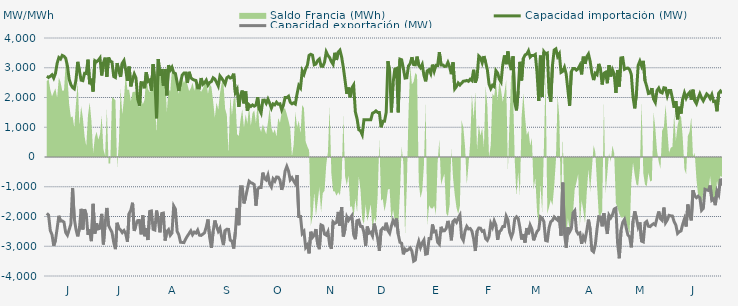
| Category | Capacidad importación (MW) | Capacidad exportación (MW) |
|---|---|---|
| 0 | 2714.417 | -1890.667 |
| 1900-01-01 | 2675.25 | -1952.042 |
| 1900-01-02 | 2712.625 | -2473.333 |
| 1900-01-03 | 2762.542 | -2608.917 |
| 1900-01-04 | 2652 | -2984.583 |
| 1900-01-05 | 2806.792 | -2803.333 |
| 1900-01-06 | 3151.167 | -2401.458 |
| 1900-01-07 | 3341.792 | -1976.417 |
| 1900-01-08 | 3295.083 | -2154.25 |
| 1900-01-09 | 3415.542 | -2148.458 |
| 1900-01-10 | 3386.458 | -2191.625 |
| 1900-01-11 | 3315.833 | -2538.333 |
| 1900-01-12 | 3059.75 | -2627.417 |
| 1900-01-13 | 2619.042 | -2445.958 |
| 1900-01-14 | 2434.542 | -2258.708 |
| 1900-01-15 | 2336.958 | -1043.75 |
| 1900-01-16 | 2291.5 | -2066.667 |
| 1900-01-17 | 2591.375 | -2432.417 |
| 1900-01-18 | 3198.167 | -2666.208 |
| 1900-01-19 | 2894.833 | -2404.875 |
| 1900-01-20 | 2582.208 | -1743.542 |
| 1900-01-21 | 2566.333 | -2434.875 |
| 1900-01-22 | 2811.458 | -1757.708 |
| 1900-01-23 | 2808 | -1938.167 |
| 1900-01-24 | 3272.083 | -2618.542 |
| 1900-01-25 | 2447.208 | -2437.333 |
| 1900-01-26 | 2633.208 | -2826.667 |
| 1900-01-27 | 2202.083 | -1575 |
| 1900-01-28 | 3237.583 | -2574.625 |
| 1900-01-29 | 3201.042 | -2230.542 |
| 1900-01-30 | 3248.625 | -2416.417 |
| 1900-01-31 | 3327.583 | -2395.083 |
| 1900-02-01 | 2740.958 | -1910.417 |
| 1900-02-02 | 3160.083 | -2937.917 |
| 1900-02-03 | 3339 | -2237.833 |
| 1900-02-04 | 2697.208 | -1712.5 |
| 1900-02-05 | 3342.917 | -2305.083 |
| 1900-02-06 | 3218 | -2421.583 |
| 1900-02-07 | 3194.333 | -2530.333 |
| 1900-02-08 | 2706.458 | -2869.083 |
| 1900-02-09 | 2673 | -3096.5 |
| 1900-02-10 | 3156.5 | -2212.083 |
| 1900-02-11 | 2884.958 | -2401.708 |
| 1900-02-12 | 2692.292 | -2450.833 |
| 1900-02-13 | 3152.125 | -2539.5 |
| 1900-02-14 | 3244.042 | -2473.208 |
| 1900-02-15 | 2930.458 | -2581.292 |
| 1900-02-16 | 2559.833 | -2848.708 |
| 1900-02-17 | 3037.583 | -1901.417 |
| 1900-02-18 | 2375 | -1787.5 |
| 1900-02-19 | 2608.75 | -1537.5 |
| 1900-02-20 | 2790.667 | -2487.458 |
| 1900-02-21 | 2656.542 | -2277.167 |
| 1900-02-22 | 1950.833 | -2138.208 |
| 1900-02-23 | 1725 | -2133.333 |
| 1900-02-24 | 2500 | -2600 |
| 1900-02-25 | 2493.5 | -1964.583 |
| 1900-02-26 | 2311.125 | -2662.542 |
| 1900-02-27 | 2848.5 | -2386.333 |
| 1900-02-28 | 2541.5 | -2790.625 |
| 1900-02-28 | 2586.083 | -1829.542 |
| 1900-03-01 | 2229.167 | -1813.75 |
| 1900-03-02 | 3118.458 | -2430.875 |
| 1900-03-03 | 2560.5 | -2453.333 |
| 1900-03-04 | 1300 | -1800 |
| 1900-03-05 | 3293.208 | -2107.333 |
| 1900-03-06 | 2732.333 | -2531.667 |
| 1900-03-07 | 2958.208 | -1899.667 |
| 1900-03-08 | 2400 | -1885.417 |
| 1900-03-09 | 2949.792 | -2809.042 |
| 1900-03-10 | 2072.292 | -2500 |
| 1900-03-11 | 3083.958 | -2440.167 |
| 1900-03-12 | 2921.208 | -2632.667 |
| 1900-03-13 | 3017.667 | -2556.542 |
| 1900-03-14 | 2833.833 | -1646.083 |
| 1900-03-15 | 2807.833 | -1750 |
| 1900-03-16 | 2510.417 | -2496.792 |
| 1900-03-17 | 2220.833 | -2618.625 |
| 1900-03-18 | 2512.5 | -2867.042 |
| 1900-03-19 | 2756.375 | -2870.75 |
| 1900-03-20 | 2821.542 | -2876.667 |
| 1900-03-21 | 2821.833 | -2755.625 |
| 1900-03-22 | 2490.292 | -2656.833 |
| 1900-03-23 | 2862.667 | -2571.458 |
| 1900-03-24 | 2663.042 | -2482.25 |
| 1900-03-25 | 2613.625 | -2612.792 |
| 1900-03-26 | 2585.667 | -2523.458 |
| 1900-03-27 | 2571.292 | -2556.167 |
| 1900-03-28 | 2320.458 | -2456.542 |
| 1900-03-29 | 2316.542 | -2627.667 |
| 1900-03-30 | 2652.5 | -2635.708 |
| 1900-03-31 | 2442.625 | -2594.208 |
| 1900-04-01 | 2493.458 | -2546.125 |
| 1900-04-02 | 2582.917 | -2351.208 |
| 1900-04-03 | 2416.667 | -2100 |
| 1900-04-04 | 2504.5 | -2703.167 |
| 1900-04-05 | 2536.625 | -3052.25 |
| 1900-04-06 | 2662.208 | -2510.833 |
| 1900-04-07 | 2620.667 | -2134.75 |
| 1900-04-08 | 2511.833 | -2330.583 |
| 1900-04-09 | 2387.333 | -2494.25 |
| 1900-04-10 | 2724.583 | -2389 |
| 1900-04-11 | 2648.667 | -2691.542 |
| 1900-04-12 | 2557.292 | -2961.542 |
| 1900-04-13 | 2454.083 | -2472.25 |
| 1900-04-14 | 2661.417 | -2427.292 |
| 1900-04-15 | 2704.833 | -2434.167 |
| 1900-04-16 | 2653.75 | -2795.833 |
| 1900-04-17 | 2673.75 | -2822.875 |
| 1900-04-18 | 2800.917 | -3075.208 |
| 1900-04-19 | 2164.417 | -2510.625 |
| 1900-04-20 | 2270.833 | -1713.542 |
| 1900-04-21 | 1687.5 | -2291.667 |
| 1900-04-22 | 2066.667 | -1000 |
| 1900-04-23 | 2233.333 | -1000 |
| 1900-04-24 | 1804.167 | -1561.333 |
| 1900-04-25 | 2201.833 | -1341.667 |
| 1900-04-26 | 1556.25 | -1070.833 |
| 1900-04-27 | 1756.25 | -812.5 |
| 1900-04-28 | 1700 | -864.583 |
| 1900-04-29 | 1750 | -885.417 |
| 1900-04-30 | 1708.333 | -929.167 |
| 1900-05-01 | 1743.75 | -1636.25 |
| 1900-05-02 | 2008.083 | -1077.083 |
| 1900-05-03 | 1602.083 | -1020.833 |
| 1900-05-04 | 1479.167 | -1022.917 |
| 1900-05-05 | 1910.417 | -525 |
| 1900-05-06 | 1912.5 | -727.083 |
| 1900-05-07 | 1804.167 | -775 |
| 1900-05-08 | 1945.833 | -608.333 |
| 1900-05-09 | 1808.333 | -904.167 |
| 1900-05-10 | 1641.667 | -1006.25 |
| 1900-05-11 | 1785.417 | -735.417 |
| 1900-05-12 | 1752.083 | -812.5 |
| 1900-05-13 | 1841.667 | -675 |
| 1900-05-14 | 1772.917 | -677.083 |
| 1900-05-15 | 1788 | -777.083 |
| 1900-05-16 | 1587.5 | -1104.167 |
| 1900-05-17 | 1737.5 | -900 |
| 1900-05-18 | 1997.917 | -475 |
| 1900-05-19 | 1995.833 | -316.667 |
| 1900-05-20 | 2041.667 | -468.75 |
| 1900-05-21 | 1843.75 | -766.667 |
| 1900-05-22 | 1787.5 | -695.833 |
| 1900-05-23 | 1820.833 | -808.333 |
| 1900-05-24 | 1781.25 | -900 |
| 1900-05-25 | 2126.667 | -608.333 |
| 1900-05-26 | 2404.417 | -2000 |
| 1900-05-27 | 2323.167 | -2000 |
| 1900-05-28 | 2893.583 | -2571.5 |
| 1900-05-29 | 2778.083 | -2500.25 |
| 1900-05-30 | 2965.5 | -3038.667 |
| 1900-05-31 | 3083.64 | -2955.48 |
| 1900-06-01 | 3418.208 | -3238.958 |
| 1900-06-02 | 3452.875 | -2513.333 |
| 1900-06-03 | 3420.292 | -2703.208 |
| 1900-06-04 | 3100.083 | -2630.333 |
| 1900-06-05 | 3123.375 | -2422.458 |
| 1900-06-06 | 3242.792 | -2928.833 |
| 1900-06-07 | 3294.958 | -3098.417 |
| 1900-06-08 | 3054.042 | -2285.333 |
| 1900-06-09 | 3047.542 | -2315.25 |
| 1900-06-10 | 3179.458 | -2592.333 |
| 1900-06-11 | 3533.833 | -2627.792 |
| 1900-06-12 | 3414 | -2509.75 |
| 1900-06-13 | 3340.25 | -2944.208 |
| 1900-06-14 | 3208.208 | -3084.875 |
| 1900-06-15 | 3116.333 | -2180.292 |
| 1900-06-16 | 3502.875 | -2231.333 |
| 1900-06-17 | 3262.542 | -2201.667 |
| 1900-06-18 | 3524.167 | -1845.708 |
| 1900-06-19 | 3589.042 | -2314 |
| 1900-06-20 | 3358.375 | -1684.042 |
| 1900-06-21 | 3002 | -2672.375 |
| 1900-06-22 | 2567.583 | -2409.375 |
| 1900-06-23 | 2121 | -2013.417 |
| 1900-06-24 | 2334.5 | -2132.333 |
| 1900-06-25 | 2006.833 | -2047.042 |
| 1900-06-26 | 2325 | -1968.542 |
| 1900-06-27 | 2420.75 | -2611.292 |
| 1900-06-28 | 1517.25 | -2763 |
| 1900-06-29 | 1283.917 | -2141.667 |
| 1900-06-30 | 916.417 | -2120.833 |
| 1900-07-01 | 879.167 | -2332.417 |
| 1900-07-02 | 750 | -2334.958 |
| 1900-07-03 | 1250 | -2536 |
| 1900-07-04 | 1250 | -2982 |
| 1900-07-05 | 1250 | -2338.583 |
| 1900-07-06 | 1250 | -2558.333 |
| 1900-07-07 | 1250 | -2526.375 |
| 1900-07-08 | 1470.833 | -2652.25 |
| 1900-07-09 | 1500 | -2239.292 |
| 1900-07-10 | 1550 | -2486.75 |
| 1900-07-11 | 1500 | -2733.5 |
| 1900-07-12 | 1500 | -3155.125 |
| 1900-07-13 | 1000 | -2458.542 |
| 1900-07-14 | 1200 | -2385.25 |
| 1900-07-15 | 1200 | -2419 |
| 1900-07-16 | 1500 | -2208.75 |
| 1900-07-17 | 3221.708 | -2468.625 |
| 1900-07-18 | 2881.375 | -2561.25 |
| 1900-07-19 | 1500 | -2320.833 |
| 1900-07-20 | 2479.75 | -2136.875 |
| 1900-07-21 | 2947.875 | -2253.917 |
| 1900-07-22 | 2974.833 | -2068.75 |
| 1900-07-23 | 1500 | -2595.083 |
| 1900-07-24 | 3289.208 | -2867.583 |
| 1900-07-25 | 3267.875 | -2898.625 |
| 1900-07-26 | 2979.083 | -3270.083 |
| 1900-07-27 | 2652.375 | -3097.333 |
| 1900-07-28 | 2663.208 | -3144.542 |
| 1900-07-29 | 3058.292 | -3107.917 |
| 1900-07-30 | 3141.958 | -3054.292 |
| 1900-07-31 | 3354.667 | -3163.833 |
| 1900-08-01 | 3106.083 | -3500.875 |
| 1900-08-02 | 3099.042 | -3464.417 |
| 1900-08-03 | 3374.208 | -3046.25 |
| 1900-08-04 | 3081.083 | -2836.417 |
| 1900-08-05 | 3002 | -3040.417 |
| 1900-08-06 | 3113.875 | -2884.417 |
| 1900-08-07 | 2746.792 | -2789.333 |
| 1900-08-08 | 2544 | -3266.167 |
| 1900-08-09 | 2896.458 | -3250.667 |
| 1900-08-10 | 2937 | -2740.375 |
| 1900-08-11 | 2803.458 | -2745 |
| 1900-08-12 | 3104.125 | -2267.833 |
| 1900-08-13 | 2884.333 | -2514.583 |
| 1900-08-14 | 3081.042 | -2493.458 |
| 1900-08-15 | 3079.083 | -2866 |
| 1900-08-16 | 3524.292 | -2932.083 |
| 1900-08-17 | 3096.5 | -2347.083 |
| 1900-08-18 | 3096.5 | -2484.875 |
| 1900-08-19 | 3044.417 | -2478.583 |
| 1900-08-20 | 3048.167 | -2403.5 |
| 1900-08-21 | 3181.083 | -2147.542 |
| 1900-08-22 | 3030.708 | -2365.833 |
| 1900-08-23 | 2784.5 | -2801.333 |
| 1900-08-24 | 3182.417 | -2165.083 |
| 1900-08-25 | 2292.583 | -2110.5 |
| 1900-08-26 | 2370.25 | -2192.75 |
| 1900-08-27 | 2487.208 | -2051.417 |
| 1900-08-28 | 2421.292 | -1952.083 |
| 1900-08-29 | 2482.917 | -2699.375 |
| 1900-08-30 | 2548.458 | -2805.375 |
| 1900-08-31 | 2554.458 | -2484.042 |
| 1900-09-01 | 2574.083 | -2331.417 |
| 1900-09-02 | 2544.458 | -2417.833 |
| 1900-09-03 | 2615.833 | -2403.25 |
| 1900-09-04 | 2568.917 | -2488.625 |
| 1900-09-05 | 2932.208 | -2748.875 |
| 1900-09-06 | 2500.875 | -3160.125 |
| 1900-09-07 | 2689.458 | -2491.667 |
| 1900-09-08 | 3392.292 | -2386.5 |
| 1900-09-09 | 3335.083 | -2392.75 |
| 1900-09-10 | 3167.5 | -2500.5 |
| 1900-09-11 | 3390.625 | -2475.917 |
| 1900-09-12 | 3180.958 | -2741.75 |
| 1900-09-13 | 2936.5 | -2801.625 |
| 1900-09-14 | 2452.792 | -2674.667 |
| 1900-09-15 | 2300.208 | -2235.25 |
| 1900-09-16 | 2411.792 | -2365.167 |
| 1900-09-17 | 2366.75 | -2147.917 |
| 1900-09-18 | 2902.042 | -2292.875 |
| 1900-09-19 | 2822.25 | -2784.375 |
| 1900-09-20 | 2619.333 | -2505.792 |
| 1900-09-21 | 2523.292 | -2462.542 |
| 1900-09-22 | 3101.75 | -2337.5 |
| 1900-09-23 | 3414.042 | -2335.5 |
| 1900-09-24 | 3119.417 | -1987.458 |
| 1900-09-25 | 3547.333 | -2114.583 |
| 1900-09-26 | 3135.708 | -2530.042 |
| 1900-09-27 | 2921.125 | -2699.333 |
| 1900-09-28 | 3380.917 | -2535.75 |
| 1900-09-29 | 1842.042 | -2078.542 |
| 1900-09-30 | 1566.833 | -2010.417 |
| 1900-10-01 | 2214.542 | -2066.667 |
| 1900-10-02 | 3198.583 | -2370 |
| 1900-10-03 | 2574 | -2772.958 |
| 1900-10-04 | 3310.583 | -2592.083 |
| 1900-10-05 | 3430.75 | -2875.542 |
| 1900-10-06 | 3458.333 | -2387.75 |
| 1900-10-07 | 3568.125 | -2599.208 |
| 1900-10-08 | 3355.708 | -2294.333 |
| 1900-10-09 | 3414.333 | -2427 |
| 1900-10-10 | 3410.542 | -2802.125 |
| 1900-10-11 | 3447.375 | -2640.958 |
| 1900-10-12 | 2831.208 | -2506.667 |
| 1900-10-13 | 1881.583 | -2434.25 |
| 1900-10-14 | 3406.708 | -2011.583 |
| 1900-10-15 | 2022.5 | -2050 |
| 1900-10-16 | 3540.875 | -2176.417 |
| 1900-10-17 | 3466.542 | -2807.167 |
| 1900-10-18 | 3493.375 | -2823.167 |
| 1900-10-19 | 2166.833 | -2382.125 |
| 1900-10-20 | 1859.958 | -2177.167 |
| 1900-10-21 | 3077.875 | -2132.833 |
| 1900-10-22 | 3595.75 | -2015.417 |
| 1900-10-23 | 3634.375 | -2069.417 |
| 1900-10-24 | 3379.833 | -2125 |
| 1900-10-25 | 3470.304 | -1991.957 |
| 1900-10-26 | 2844 | -2641.708 |
| 1900-10-27 | 2880.625 | -862.5 |
| 1900-10-28 | 3017.208 | -2558.208 |
| 1900-10-29 | 2787.708 | -3047.042 |
| 1900-10-30 | 2256.625 | -2365.667 |
| 1900-10-31 | 1722.917 | -2515.917 |
| 1900-11-01 | 2869 | -2405.667 |
| 1900-11-02 | 2973.167 | -1879.167 |
| 1900-11-03 | 2971 | -1806.25 |
| 1900-11-04 | 2919.208 | -2484.833 |
| 1900-11-05 | 2973.125 | -2583.917 |
| 1900-11-06 | 3083.25 | -2551.375 |
| 1900-11-07 | 2777.875 | -2917.292 |
| 1900-11-08 | 3371.833 | -2672.292 |
| 1900-11-09 | 3131 | -2785.25 |
| 1900-11-10 | 3368.375 | -2480.958 |
| 1900-11-11 | 3462.292 | -2105.333 |
| 1900-11-12 | 3215.917 | -2442.958 |
| 1900-11-13 | 2817.875 | -3136.917 |
| 1900-11-14 | 2586 | -3188.792 |
| 1900-11-15 | 2815 | -2954.042 |
| 1900-11-16 | 2767 | -2418.75 |
| 1900-11-17 | 3129.208 | -2005 |
| 1900-11-18 | 2953.792 | -2013.417 |
| 1900-11-19 | 2437.083 | -2329.833 |
| 1900-11-20 | 2815.958 | -1889.333 |
| 1900-11-21 | 2849.708 | -2257.667 |
| 1900-11-22 | 2479.208 | -2586.833 |
| 1900-11-23 | 3084.333 | -1954.5 |
| 1900-11-24 | 2707.042 | -2046.583 |
| 1900-11-25 | 2933.542 | -1941.667 |
| 1900-11-26 | 2795.917 | -1750 |
| 1900-11-27 | 2158.042 | -1718.75 |
| 1900-11-28 | 2918.875 | -2898.083 |
| 1900-11-29 | 2368.375 | -3404.167 |
| 1900-11-30 | 3329.75 | -2465.083 |
| 1900-12-01 | 3339.208 | -2197.25 |
| 1900-12-02 | 2948.5 | -2100.583 |
| 1900-12-03 | 2980.792 | -2371.042 |
| 1900-12-04 | 2990.708 | -2620.708 |
| 1900-12-05 | 2938.333 | -2683 |
| 1900-12-06 | 2774.542 | -3036.75 |
| 1900-12-07 | 2014.917 | -2156.292 |
| 1900-12-08 | 1635.417 | -1825.292 |
| 1900-12-09 | 2140.25 | -2060.75 |
| 1900-12-10 | 3080.917 | -2353.125 |
| 1900-12-11 | 3223.333 | -2199.083 |
| 1900-12-12 | 3058.083 | -2827.667 |
| 1900-12-13 | 3231.167 | -2853.292 |
| 1900-12-14 | 2562 | -2213.625 |
| 1900-12-15 | 2375 | -2164.25 |
| 1900-12-16 | 2133.333 | -2329.5 |
| 1900-12-17 | 2150 | -2341.083 |
| 1900-12-18 | 2314.583 | -2282 |
| 1900-12-19 | 1943.75 | -2242.25 |
| 1900-12-20 | 1835.625 | -2285.208 |
| 1900-12-21 | 2235.417 | -2055.542 |
| 1900-12-22 | 2316.667 | -1831.25 |
| 1900-12-23 | 2180.208 | -2072.625 |
| 1900-12-24 | 2154.167 | -2129.667 |
| 1900-12-25 | 2327.667 | -1699.458 |
| 1900-12-26 | 2314.067 | -2210.167 |
| 1900-12-27 | 2057.521 | -2118.083 |
| 1900-12-28 | 2237.25 | -1961.958 |
| 1900-12-29 | 2236.533 | -1977.083 |
| 1900-12-30 | 1969.792 | -1985.792 |
| 1900-12-31 | 1658.333 | -2177.417 |
| 1901-01-01 | 1877.083 | -2287.667 |
| 1901-01-02 | 1267.292 | -2568.708 |
| 1901-01-03 | 1690.417 | -2512.667 |
| 1901-01-04 | 1461.667 | -2486.333 |
| 1901-01-05 | 1948.958 | -2259.083 |
| 1901-01-06 | 2154.167 | -2079.5 |
| 1901-01-07 | 1979.167 | -2336.083 |
| 1901-01-08 | 2104.167 | -1597.917 |
| 1901-01-09 | 2171.875 | -1954.167 |
| 1901-01-10 | 1927.604 | -2131.25 |
| 1901-01-11 | 2262.5 | -1118.75 |
| 1901-01-12 | 1890.625 | -1314.583 |
| 1901-01-13 | 1791.667 | -1368 |
| 1901-01-14 | 1977.083 | -1316.667 |
| 1901-01-15 | 2127.083 | -1377.083 |
| 1901-01-16 | 1987.5 | -1792.083 |
| 1901-01-17 | 1887.5 | -1733.333 |
| 1901-01-18 | 2002.083 | -1085.417 |
| 1901-01-19 | 2118.75 | -1110.417 |
| 1901-01-20 | 2066.667 | -1125 |
| 1901-01-21 | 1966.667 | -958.333 |
| 1901-01-22 | 2097.917 | -1454.167 |
| 1901-01-23 | 1864.583 | -1408.854 |
| 1901-01-24 | 1877.083 | -1618.75 |
| 1901-01-25 | 1537.5 | -1143.75 |
| 1901-01-26 | 2145.833 | -1265.667 |
| 1901-01-27 | 2216.667 | -731.25 |
| 1901-01-28 | 2150 | -950 |